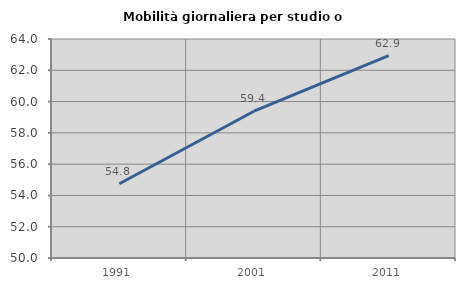
| Category | Mobilità giornaliera per studio o lavoro |
|---|---|
| 1991.0 | 54.75 |
| 2001.0 | 59.383 |
| 2011.0 | 62.934 |